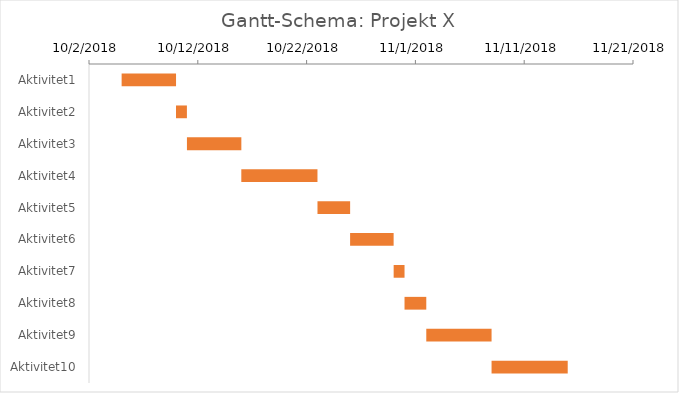
| Category | Series 0 | Series 1 |
|---|---|---|
| Aktivitet1 | 10/5/18 | 5 |
| Aktivitet2 | 10/10/18 | 1 |
| Aktivitet3 | 10/11/18 | 5 |
| Aktivitet4 | 10/16/18 | 7 |
| Aktivitet5 | 10/23/18 | 3 |
| Aktivitet6 | 10/26/18 | 4 |
| Aktivitet7 | 10/30/18 | 1 |
| Aktivitet8 | 10/31/18 | 2 |
| Aktivitet9 | 11/2/18 | 6 |
| Aktivitet10 | 11/8/18 | 7 |